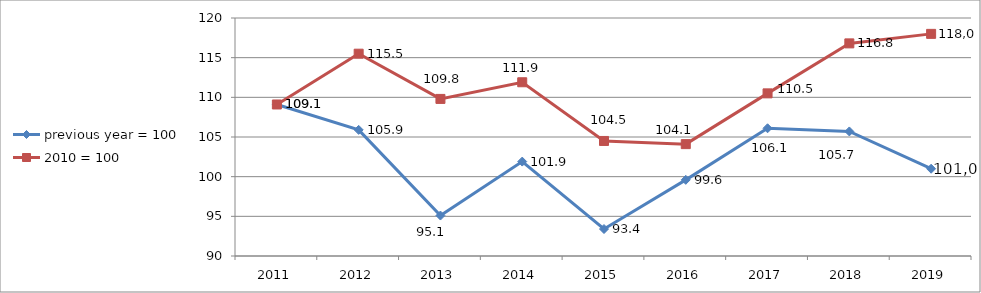
| Category |  previous year = 100 | 2010 = 100 |
|---|---|---|
| 0 | 109.1 |  |
| 1 | 105.9 |  |
| 2 | 95.1 |  |
| 3 | 101.9 |  |
| 4 | 93.4 |  |
| 5 | 99.6 |  |
| 6 | 106.1 |  |
| 7 | 105.7 |  |
| 8 | 101 |  |